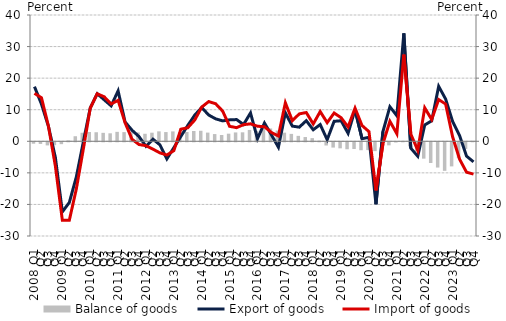
| Category | Balance of goods |
|---|---|
| 2008. I. | -0.45 |
|          II. | -0.517 |
|          III. | -0.987 |
|          IV. | -0.918 |
| 2009. I. | -0.591 |
|          II. | 0.289 |
|          III. | 1.604 |
|          IV. | 2.701 |
| 2010. I. | 2.943 |
|          II. | 2.864 |
|          III. | 2.676 |
|          IV. | 2.53 |
| 2011. I. | 2.99 |
|          II. | 2.907 |
|          III. | 2.967 |
|          IV. | 2.794 |
| 2012. I. | 2.382 |
|          II. | 2.724 |
|          III. | 3.15 |
|          IV. | 2.921 |
| 2013. I. | 3.129 |
| II. | 2.89 |
|          III. | 2.95 |
| IV. | 3.26 |
| 2014. I. | 3.333 |
| II. | 2.751 |
|          III. | 2.288 |
| IV. | 2 |
| 2015. I. | 2.409 |
| II. | 2.807 |
|          III. | 2.84 |
| IV. | 3.592 |
| 2016. I. | 3.318 |
| II. | 3.966 |
|          III. | 4.066 |
| IV. | 3.404 |
| 2017. I. | 2.731 |
| II. | 2.347 |
|          III. | 1.718 |
| IV. | 1.348 |
| 2018. I. | 1.008 |
| II. | 0.195 |
|          III. | -1.016 |
| IV. | -1.677 |
| 2019. I. | -1.92 |
| II. | -2.211 |
|          III. | -2.126 |
| IV. | -2.519 |
| 2020. I. | -2.477 |
| II. | -2.803 |
|          III. | -1.908 |
| IV. | -0.969 |
| 2021. I. | -0.074 |
| II. | 0.113 |
|          III. | -1.292 |
| IV. | -2.887 |
| 2022. I. | -5.184 |
| II. | -6.556 |
|          III. | -8.008 |
| IV. | -9.045 |
| 2023. I. | -7.636 |
| II. | -5.039 |
|          III. | -2.1 |
| IV. | 0.142 |